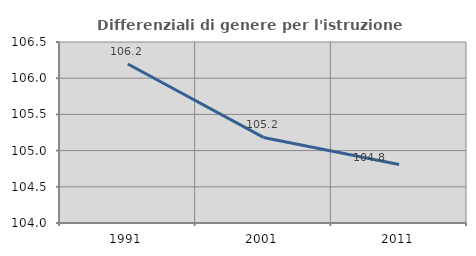
| Category | Differenziali di genere per l'istruzione superiore |
|---|---|
| 1991.0 | 106.195 |
| 2001.0 | 105.182 |
| 2011.0 | 104.808 |